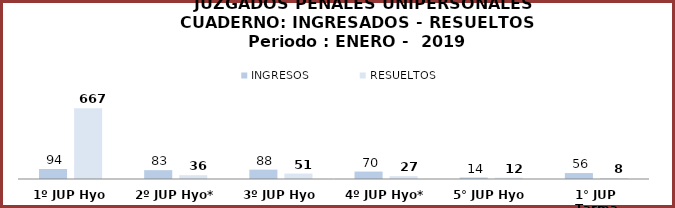
| Category | INGRESOS | RESUELTOS |
|---|---|---|
| 1º JUP Hyo | 94 | 667 |
| 2º JUP Hyo* | 83 | 36 |
| 3º JUP Hyo | 88 | 51 |
| 4º JUP Hyo* | 70 | 27 |
| 5° JUP Hyo | 14 | 12 |
| 1° JUP Tarma | 56 | 8 |